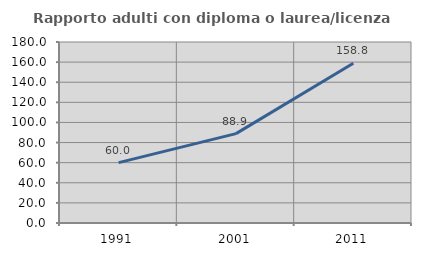
| Category | Rapporto adulti con diploma o laurea/licenza media  |
|---|---|
| 1991.0 | 60 |
| 2001.0 | 88.889 |
| 2011.0 | 158.824 |